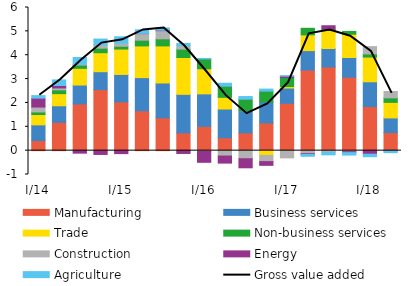
| Category | Manufacturing | Business services | Trade | Non-business services | Construction | Energy | Agriculture |
|---|---|---|---|---|---|---|---|
| I/14 | 0.421 | 0.66 | 0.432 | 0.109 | 0.205 | 0.374 | 0.105 |
| II | 1.187 | 0.694 | 0.508 | 0.16 | 0.08 | 0.102 | 0.233 |
| III | 1.957 | 0.794 | 0.7 | 0.137 | 0.035 | -0.106 | 0.281 |
|  IV | 2.558 | 0.751 | 0.795 | 0.191 | 0.135 | -0.16 | 0.247 |
| I/15 | 2.046 | 1.149 | 1.064 | 0.117 | 0.13 | -0.125 | 0.268 |
| II | 1.67 | 1.39 | 1.329 | 0.241 | 0.274 | 0.01 | 0.149 |
| III | 1.377 | 1.459 | 1.554 | 0.297 | 0.343 | 0.019 | 0.094 |
| IV | 0.746 | 1.614 | 1.545 | 0.351 | 0.143 | -0.119 | 0.094 |
| I/16 | 1.017 | 1.362 | 1.053 | 0.411 | -0.028 | -0.461 | 0.015 |
| II | 0.541 | 1.205 | 0.489 | 0.469 | -0.227 | -0.296 | 0.12 |
| III | 0.745 | 0.932 | 0.002 | 0.476 | -0.339 | -0.38 | 0.112 |
| IV | 1.161 | 0.881 | -0.198 | 0.454 | -0.262 | -0.156 | 0.084 |
| I/17 | 1.985 | 0.64 | 0.062 | 0.376 | -0.303 | 0.058 | 0.015 |
| II | 3.377 | 0.817 | 0.659 | 0.276 | -0.131 | -0.031 | -0.075 |
| III | 3.506 | 0.775 | 0.757 | 0.059 | -0.064 | 0.138 | -0.112 |
| IV | 3.077 | 0.827 | 0.978 | 0.114 | -0.044 | -0.039 | -0.102 |
| I/18 | 1.848 | 1.038 | 1.036 | 0.132 | 0.306 | -0.149 | -0.105 |
| II | 0.757 | 0.615 | 0.653 | 0.19 | 0.265 | -0.006 | -0.079 |